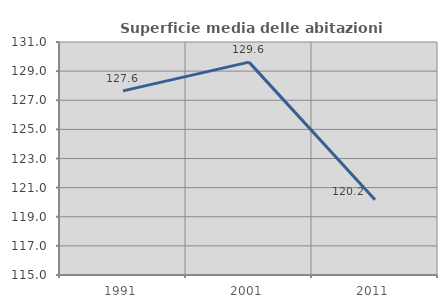
| Category | Superficie media delle abitazioni occupate |
|---|---|
| 1991.0 | 127.643 |
| 2001.0 | 129.618 |
| 2011.0 | 120.174 |